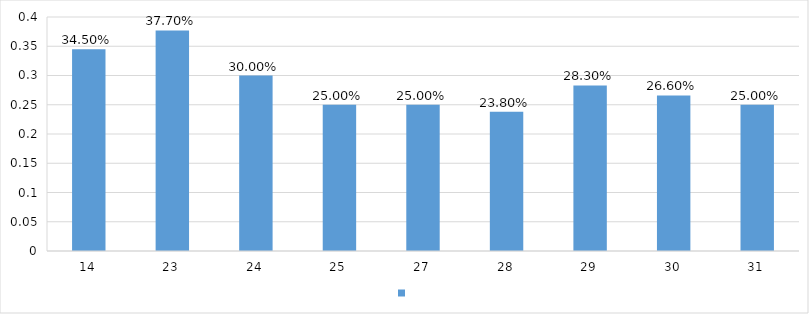
| Category | Series 0 |
|---|---|
| 14 | 0.345 |
| 23 | 0.377 |
| 24 | 0.3 |
| 25 | 0.25 |
| 27 | 0.25 |
| 28 | 0.238 |
| 29 | 0.283 |
| 30 | 0.266 |
| 31 | 0.25 |